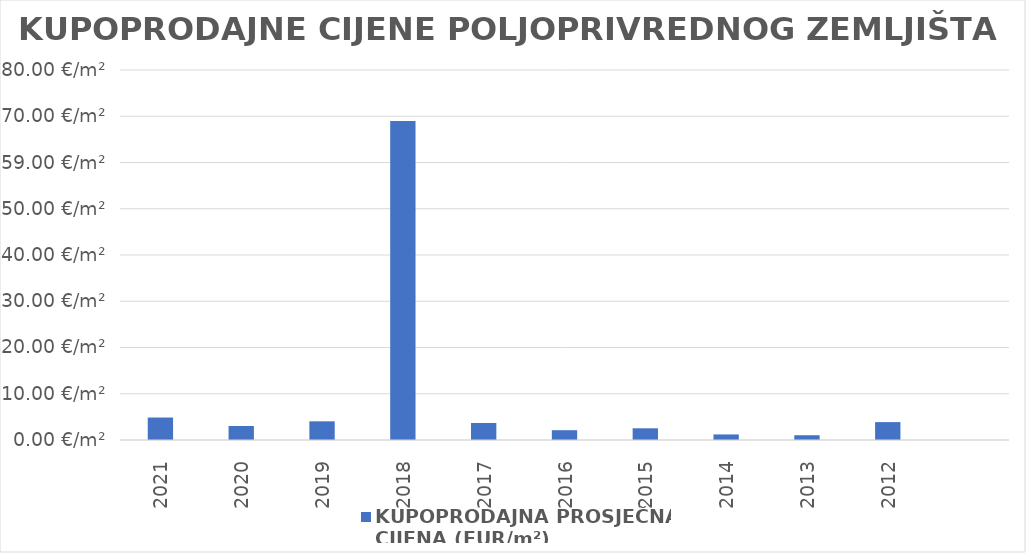
| Category | KUPOPRODAJNA PROSJEČNA 
CIJENA (EUR/m²) |
|---|---|
| 2021 | 1900-01-04 20:35:15 |
| 2020 | 1900-01-03 00:47:57 |
| 2019 | 1900-01-04 00:56:10 |
| 2018 | 1900-03-08 23:06:04 |
| 2017 | 1900-01-03 16:19:08 |
| 2016 | 1900-01-02 02:51:11 |
| 2015 | 1900-01-02 12:44:40 |
| 2014 | 1900-01-01 04:53:10 |
| 2013 | 1900-01-01 00:44:26 |
| 2012 | 1900-01-03 20:47:29 |